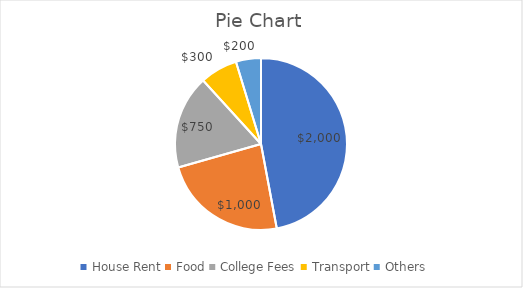
| Category | Amount |
|---|---|
| House Rent | 2000 |
| Food | 1000 |
| College Fees | 750 |
| Transport | 300 |
| Others | 200 |